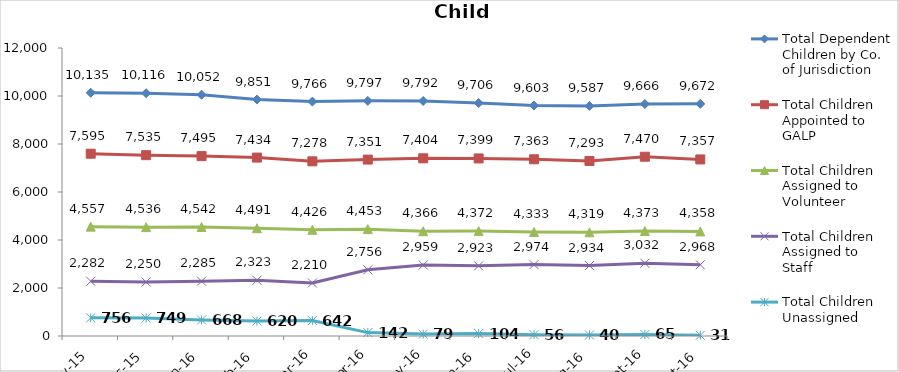
| Category | Total Dependent Children by Co. of Jurisdiction | Total Children Appointed to GALP | Total Children Assigned to Volunteer | Total Children Assigned to Staff | Total Children Unassigned |
|---|---|---|---|---|---|
| Nov-15 | 10135 | 7595 | 4557 | 2282 | 756 |
| Dec-15 | 10116 | 7535 | 4536 | 2250 | 749 |
| Jan-16 | 10052 | 7495 | 4542 | 2285 | 668 |
| Feb-16 | 9851 | 7434 | 4491 | 2323 | 620 |
| Mar-16 | 9766 | 7278 | 4426 | 2210 | 642 |
| Apr-16 | 9797 | 7351 | 4453 | 2756 | 142 |
| May-16 | 9792 | 7404 | 4366 | 2959 | 79 |
| Jun-16 | 9706 | 7399 | 4372 | 2923 | 104 |
| Jul-16 | 9603 | 7363 | 4333 | 2974 | 56 |
| Aug-16 | 9587 | 7293 | 4319 | 2934 | 40 |
| Sep-16 | 9666 | 7470 | 4373 | 3032 | 65 |
| Oct-16 | 9672 | 7357 | 4358 | 2968 | 31 |